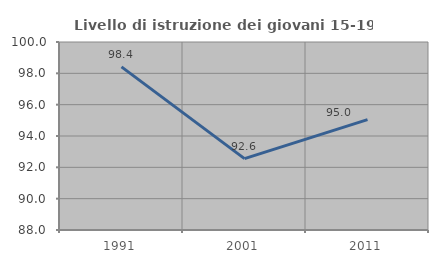
| Category | Livello di istruzione dei giovani 15-19 anni |
|---|---|
| 1991.0 | 98.413 |
| 2001.0 | 92.553 |
| 2011.0 | 95.041 |